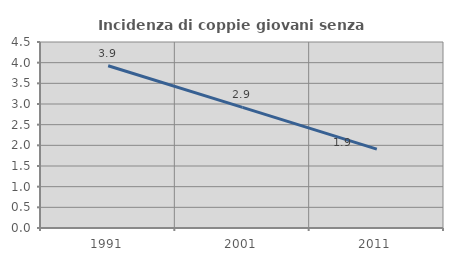
| Category | Incidenza di coppie giovani senza figli |
|---|---|
| 1991.0 | 3.925 |
| 2001.0 | 2.92 |
| 2011.0 | 1.908 |